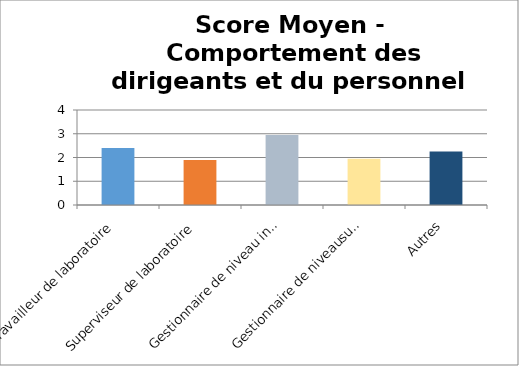
| Category | Score Moyen pour Comportement des dirigeants et du personnel |
|---|---|
| Travailleur de laboratoire | 2.4 |
| Superviseur de laboratoire | 1.9 |
| Gestionnaire de niveau intermédiaire | 2.95 |
| Gestionnaire de niveausupérieur | 1.95 |
| Autres | 2.25 |